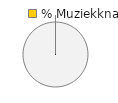
| Category | 6 - Muziekknap |
|---|---|
| 0 | 0 |
| 1 | 1 |